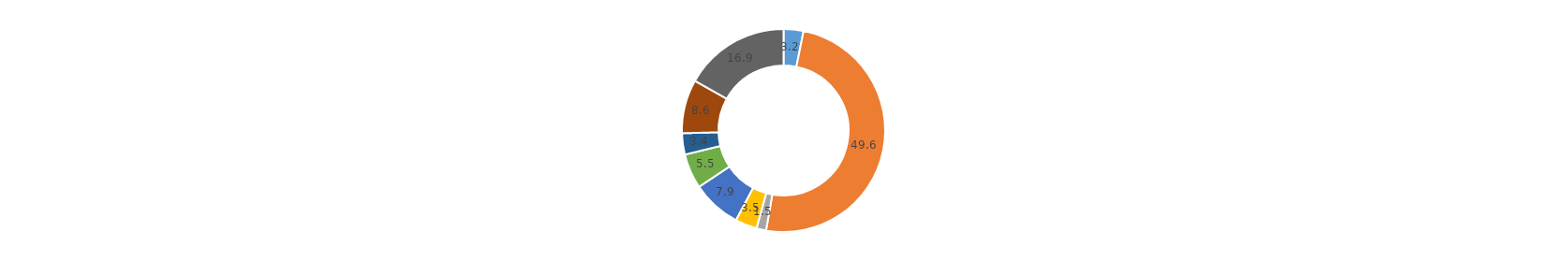
| Category | Series 0 |
|---|---|
| Раздел A | 3.165 |
| Раздел B | 49.592 |
| Раздел C | 1.534 |
| Раздел F | 3.471 |
| Раздел G | 7.869 |
| Раздел L | 5.548 |
| Раздел O | 3.392 |
| Раздел Н | 8.56 |
| Раздел НД | 16.868 |